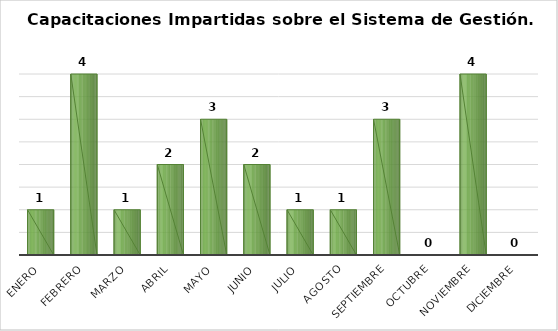
| Category | Capacitaciones impartidas/1 |
|---|---|
| Enero | 1 |
| Febrero | 4 |
| Marzo | 1 |
| Abril | 2 |
| Mayo | 3 |
| Junio | 2 |
| Julio | 1 |
| Agosto | 1 |
| Septiembre | 3 |
| Octubre | 0 |
| Noviembre | 4 |
| Diciembre | 0 |